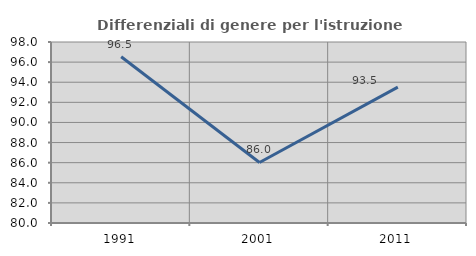
| Category | Differenziali di genere per l'istruzione superiore |
|---|---|
| 1991.0 | 96.527 |
| 2001.0 | 86.017 |
| 2011.0 | 93.508 |